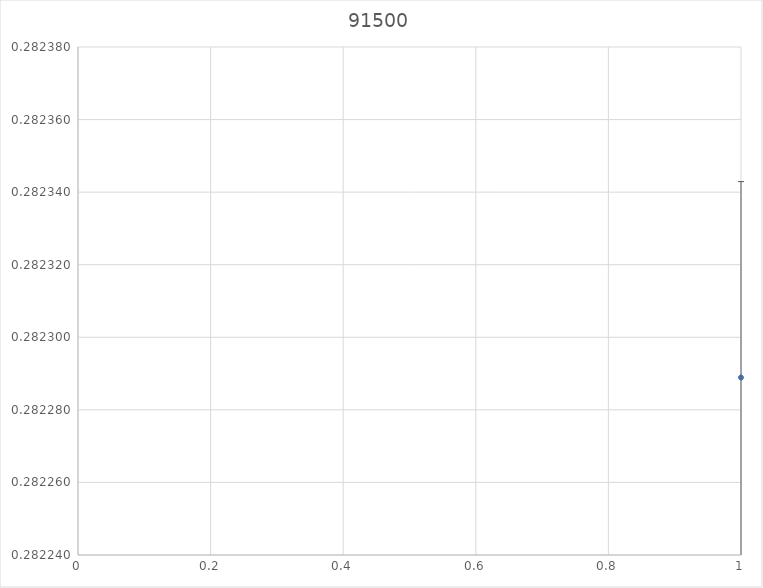
| Category | Series 0 |
|---|---|
| 0 | 0.282 |
| 1 | 0.282 |
| 2 | 0.282 |
| 3 | 0.282 |
| 4 | 0.282 |
| 5 | 0.282 |
| 6 | 0.282 |
| 7 | 0.282 |
| 8 | 0.282 |
| 9 | 0.282 |
| 10 | 0.282 |
| 11 | 0.282 |
| 12 | 0.282 |
| 13 | 0.282 |
| 14 | 0.282 |
| 15 | 0.282 |
| 16 | 0.282 |
| 17 | 0.282 |
| 18 | 0.282 |
| 19 | 0.282 |
| 20 | 0.282 |
| 21 | 0.282 |
| 22 | 0.282 |
| 23 | 0.282 |
| 24 | 0.282 |
| 25 | 0.282 |
| 26 | 0.282 |
| 27 | 0.282 |
| 28 | 0.282 |
| 29 | 0.282 |
| 30 | 0.282 |
| 31 | 0.282 |
| 32 | 0.282 |
| 33 | 0.282 |
| 34 | 0.282 |
| 35 | 0.282 |
| 36 | 0.282 |
| 37 | 0.282 |
| 38 | 0.282 |
| 39 | 0.282 |
| 40 | 0.282 |
| 41 | 0.282 |
| 42 | 0.282 |
| 43 | 0.282 |
| 44 | 0.282 |
| 45 | 0.282 |
| 46 | 0.282 |
| 47 | 0.282 |
| 48 | 0.282 |
| 49 | 0.282 |
| 50 | 0.282 |
| 51 | 0.282 |
| 52 | 0.282 |
| 53 | 0.282 |
| 54 | 0.282 |
| 55 | 0.282 |
| 56 | 0.282 |
| 57 | 0.282 |
| 58 | 0.282 |
| 59 | 0.282 |
| 60 | 0.282 |
| 61 | 0.282 |